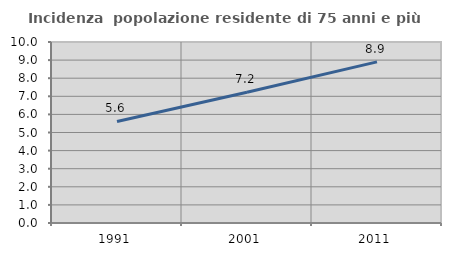
| Category | Incidenza  popolazione residente di 75 anni e più |
|---|---|
| 1991.0 | 5.611 |
| 2001.0 | 7.228 |
| 2011.0 | 8.902 |